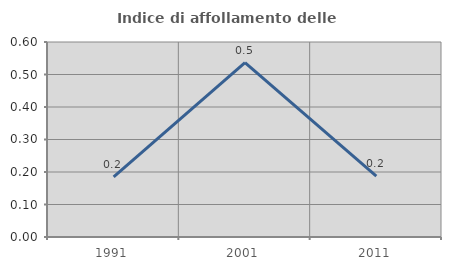
| Category | Indice di affollamento delle abitazioni  |
|---|---|
| 1991.0 | 0.185 |
| 2001.0 | 0.537 |
| 2011.0 | 0.188 |